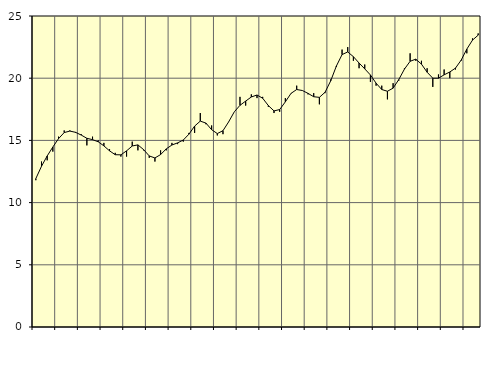
| Category | Piggar | Series 1 |
|---|---|---|
| nan | 11.8 | 11.93 |
| 1.0 | 13.3 | 12.92 |
| 1.0 | 13.4 | 13.75 |
| 1.0 | 14.1 | 14.47 |
| nan | 15.3 | 15.14 |
| 2.0 | 15.8 | 15.63 |
| 2.0 | 15.8 | 15.75 |
| 2.0 | 15.6 | 15.65 |
| nan | 15.5 | 15.43 |
| 3.0 | 14.6 | 15.17 |
| 3.0 | 15.3 | 15.06 |
| 3.0 | 15 | 14.89 |
| nan | 14.8 | 14.56 |
| 4.0 | 14.3 | 14.16 |
| 4.0 | 14 | 13.85 |
| 4.0 | 13.7 | 13.84 |
| nan | 13.7 | 14.16 |
| 5.0 | 14.9 | 14.55 |
| 5.0 | 14.2 | 14.64 |
| 5.0 | 14.2 | 14.26 |
| nan | 13.6 | 13.75 |
| 6.0 | 13.3 | 13.59 |
| 6.0 | 14.2 | 13.86 |
| 6.0 | 14.2 | 14.32 |
| nan | 14.8 | 14.63 |
| 7.0 | 14.7 | 14.8 |
| 7.0 | 14.9 | 15.03 |
| 7.0 | 15.6 | 15.5 |
| nan | 15.6 | 16.15 |
| 8.0 | 17.2 | 16.55 |
| 8.0 | 16.3 | 16.39 |
| 8.0 | 16.2 | 15.86 |
| nan | 15.4 | 15.55 |
| 9.0 | 15.5 | 15.78 |
| 9.0 | 16.5 | 16.49 |
| 9.0 | 17.3 | 17.3 |
| nan | 18.5 | 17.82 |
| 10.0 | 17.8 | 18.16 |
| 10.0 | 18.7 | 18.49 |
| 10.0 | 18.4 | 18.65 |
| nan | 18.5 | 18.39 |
| 11.0 | 17.7 | 17.8 |
| 11.0 | 17.2 | 17.37 |
| 11.0 | 17.3 | 17.48 |
| nan | 18.4 | 18.1 |
| 12.0 | 18.8 | 18.78 |
| 12.0 | 19.4 | 19.09 |
| 12.0 | 19 | 19.01 |
| nan | 18.7 | 18.78 |
| 13.0 | 18.8 | 18.51 |
| 13.0 | 17.9 | 18.46 |
| 13.0 | 18.8 | 18.87 |
| nan | 19.9 | 19.79 |
| 14.0 | 20.9 | 20.98 |
| 14.0 | 22.3 | 21.9 |
| 14.0 | 22.5 | 22.11 |
| nan | 21.4 | 21.73 |
| 15.0 | 20.8 | 21.22 |
| 15.0 | 21.1 | 20.75 |
| 15.0 | 19.7 | 20.26 |
| nan | 19.4 | 19.6 |
| 16.0 | 19.4 | 19.09 |
| 16.0 | 18.3 | 18.95 |
| 16.0 | 19.6 | 19.2 |
| nan | 19.8 | 19.89 |
| 17.0 | 20.8 | 20.73 |
| 17.0 | 22 | 21.36 |
| 17.0 | 21.4 | 21.53 |
| nan | 21.4 | 21.13 |
| 18.0 | 20.8 | 20.48 |
| 18.0 | 19.3 | 20 |
| 18.0 | 20.3 | 20 |
| nan | 20.7 | 20.27 |
| 19.0 | 20 | 20.5 |
| 19.0 | 20.7 | 20.81 |
| 19.0 | 21.4 | 21.45 |
| nan | 22 | 22.34 |
| 20.0 | 23.2 | 23.06 |
| 20.0 | 23.6 | 23.46 |